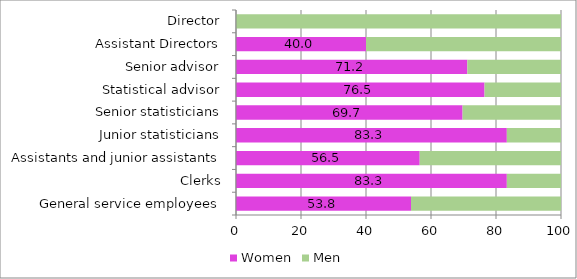
| Category | Women | Men |
|---|---|---|
| General service employees | 53.846 | 46.154 |
| Clerks | 83.333 | 16.667 |
| Assistants and junior assistants | 56.522 | 43.478 |
| Junior statisticians | 83.333 | 16.667 |
| Senior statisticians | 69.718 | 30.282 |
| Statistical advisor | 76.471 | 23.529 |
| Senior advisor | 71.186 | 28.814 |
| Assistant Directors | 40 | 60 |
| Director | 0 | 100 |